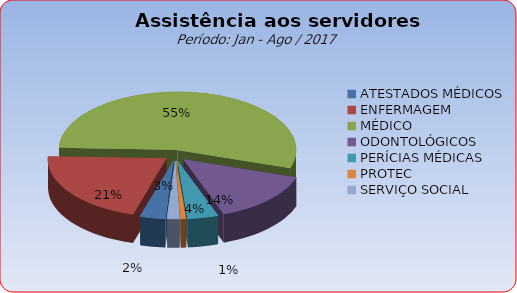
| Category | Series 0 |
|---|---|
| ATESTADOS MÉDICOS | 3.439 |
| ENFERMAGEM | 20.99 |
| MÉDICO | 54.515 |
| ODONTOLÓGICOS | 14.444 |
| PERÍCIAS MÉDICAS | 4.171 |
| PROTEC | 0.732 |
| SERVIÇO SOCIAL | 1.708 |